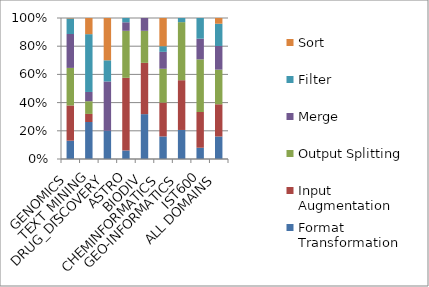
| Category | Format Transformation | Input Augmentation | Output Splitting | Merge | Filter | Sort |
|---|---|---|---|---|---|---|
| GENOMICS | 40 | 77 | 82 | 74 | 34 | 1 |
| TEXT_MINING | 32 | 7 | 11 | 8 | 50 | 14 |
| DRUG_DISCOVERY | 4 | 0 | 0 | 7 | 3 | 6 |
| ASTRO | 2 | 17 | 11 | 2 | 1 | 0 |
| BIODIV | 7 | 8 | 5 | 2 | 0 | 0 |
| CHEMINFORMATICS | 4 | 6 | 6 | 3 | 1 | 5 |
| GEO-INFORMATICS | 7 | 12 | 14 | 0 | 1 | 0 |
| IST600 | 6 | 19 | 28 | 11 | 11 | 0 |
| ALL DOMAINS | 102 | 146 | 157 | 107 | 101 | 26 |